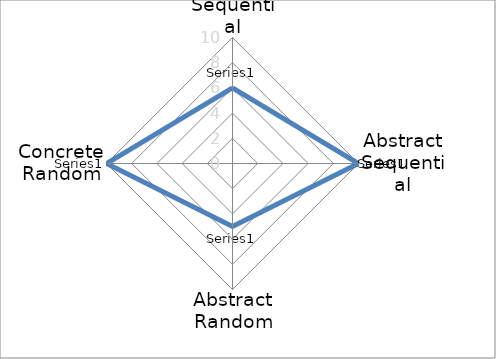
| Category | Series 0 |
|---|---|
| Concrete Sequential | 6 |
| Abstract Sequential | 10 |
| Abstract Random | 5 |
| Concrete Random | 10 |